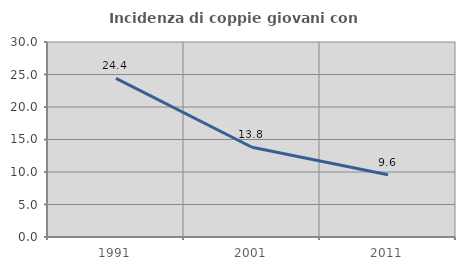
| Category | Incidenza di coppie giovani con figli |
|---|---|
| 1991.0 | 24.413 |
| 2001.0 | 13.81 |
| 2011.0 | 9.586 |